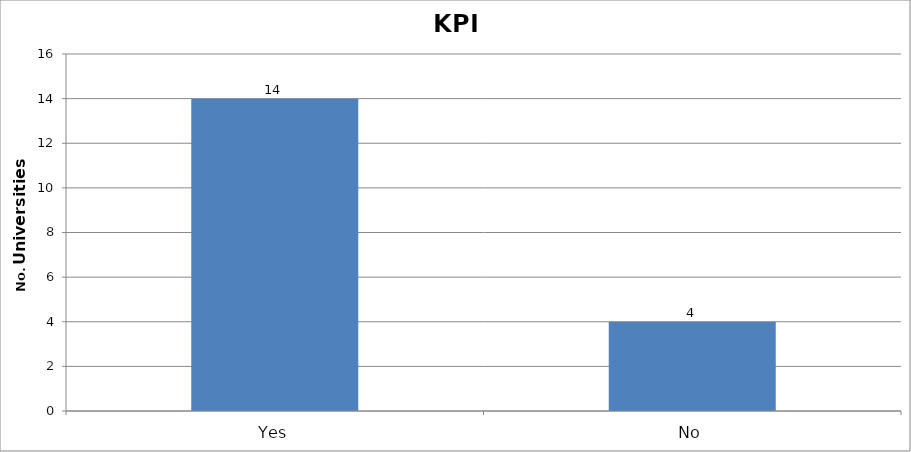
| Category | Series 0 |
|---|---|
| Yes | 14 |
| No | 4 |